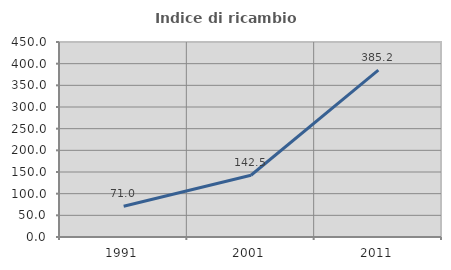
| Category | Indice di ricambio occupazionale  |
|---|---|
| 1991.0 | 70.982 |
| 2001.0 | 142.52 |
| 2011.0 | 385.185 |